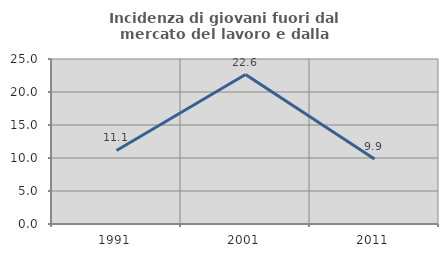
| Category | Incidenza di giovani fuori dal mercato del lavoro e dalla formazione  |
|---|---|
| 1991.0 | 11.146 |
| 2001.0 | 22.642 |
| 2011.0 | 9.859 |